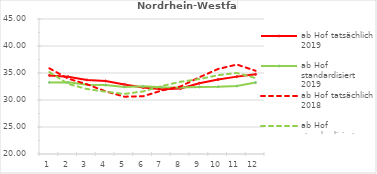
| Category | ab Hof tatsächlich 2019 | ab Hof standardisiert 2019 | ab Hof tatsächlich 2018 | ab Hof standardisiert 2018 |
|---|---|---|---|---|
| 0 | 34.557 | 33.257 | 35.863 | 35.165 |
| 1 | 34.316 | 33.266 | 33.964 | 32.98 |
| 2 | 33.725 | 32.846 | 32.912 | 32.036 |
| 3 | 33.518 | 32.76 | 31.604 | 31.534 |
| 4 | 32.888 | 32.423 | 30.614 | 31.13 |
| 5 | 32.32 | 32.523 | 30.694 | 31.59 |
| 6 | 31.992 | 32.375 | 31.761 | 32.596 |
| 7 | 32.118 | 32.331 | 32.513 | 33.376 |
| 8 | 33.102 | 32.407 | 34.208 | 33.869 |
| 9 | 33.786 | 32.441 | 35.746 | 34.602 |
| 10 | 34.329 | 32.58 | 36.564 | 35.007 |
| 11 | 34.751 | 33.234 | 35.412 | 34.059 |